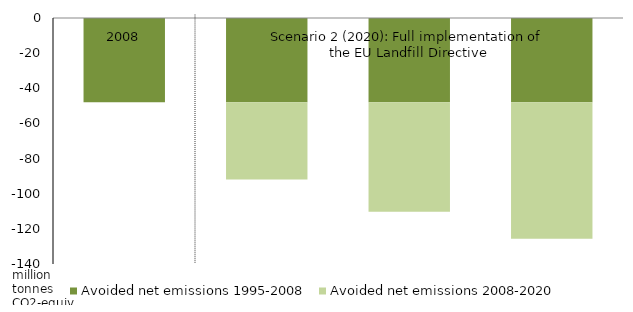
| Category | Avoided net emissions 1995-2008 | Avoided net emissions 2008-2020 |
|---|---|---|
| 2008 | -47.93 | 0 |
| Scenario 1 (2020): Business-as-usual | -47.93 | -44.015 |
| Scenario 2 (2020): Full implementation of the EU Landfill Directive | -47.93 | -62.309 |
| Scenario 3 (2020): Hypothetical landfill ban | -47.93 | -77.629 |